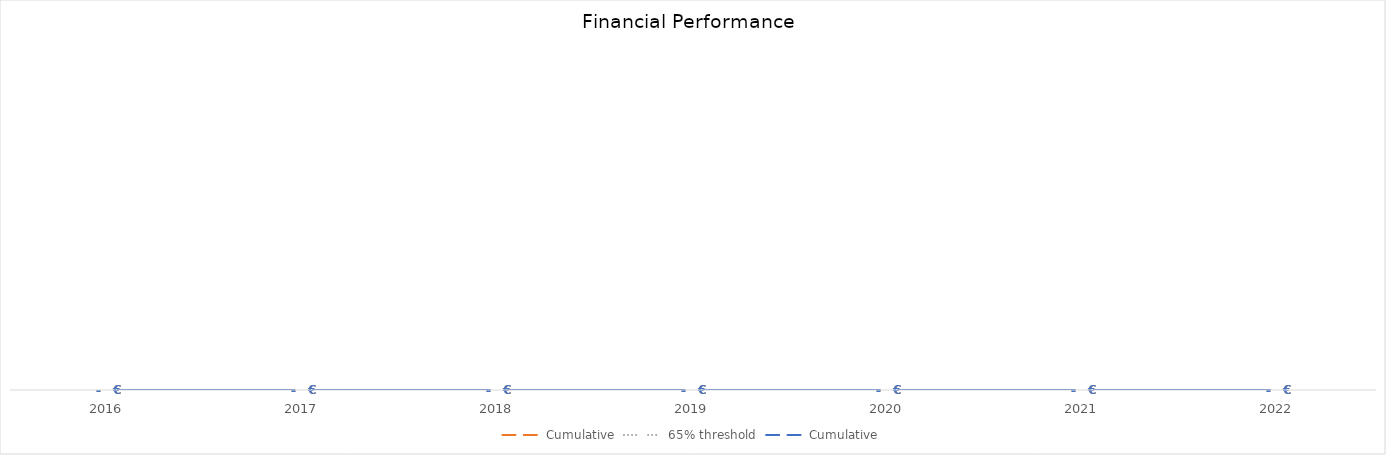
| Category | Financial targets | Financial achievements |
|---|---|---|
| 2016 | 0 | 0 |
| 2017 | 0 | 0 |
| 2018 | 0 | 0 |
| 2019 | 0 | 0 |
| 2020 | 0 | 0 |
| 2021 | 0 | 0 |
| 2022 | 0 | 0 |